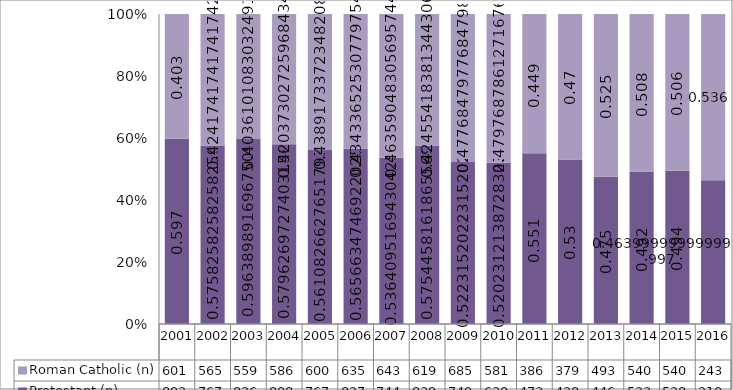
| Category | Protestant (n) | Roman Catholic (n) |
|---|---|---|
| 2001.0 | 892 | 601 |
| 2002.0 | 767 | 565 |
| 2003.0 | 826 | 559 |
| 2004.0 | 808 | 586 |
| 2005.0 | 767 | 600 |
| 2006.0 | 827 | 635 |
| 2007.0 | 744 | 643 |
| 2008.0 | 839 | 619 |
| 2009.0 | 749 | 685 |
| 2010.0 | 630 | 581 |
| 2011.0 | 473 | 386 |
| 2012.0 | 428 | 379 |
| 2013.0 | 446 | 493 |
| 2014.0 | 523 | 540 |
| 2015.0 | 528 | 540 |
| 2016.0 | 210 | 243 |